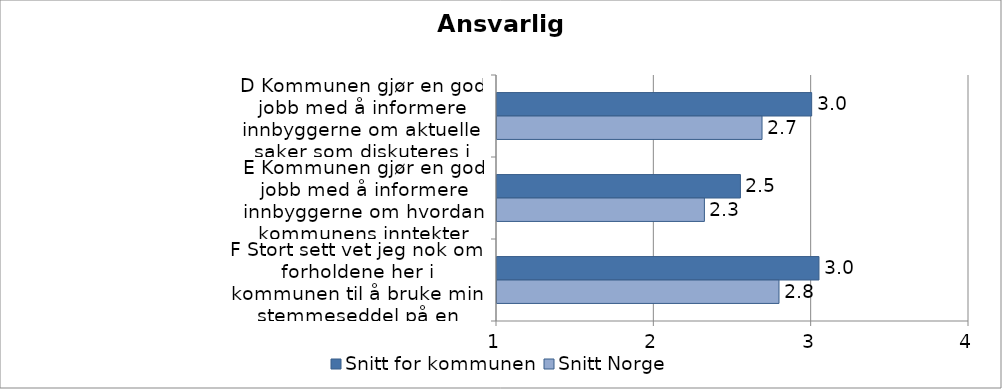
| Category | Snitt for kommunen | Snitt Norge |
|---|---|---|
| D Kommunen gjør en god jobb med å informere innbyggerne om aktuelle saker som diskuteres i kommunepolitikken | 3 | 2.684 |
| E Kommunen gjør en god jobb med å informere innbyggerne om hvordan kommunens inntekter brukes | 2.547 | 2.318 |
| F Stort sett vet jeg nok om forholdene her i kommunen til å bruke min stemmeseddel på en fornuftig måte i kommunevalget | 3.046 | 2.792 |